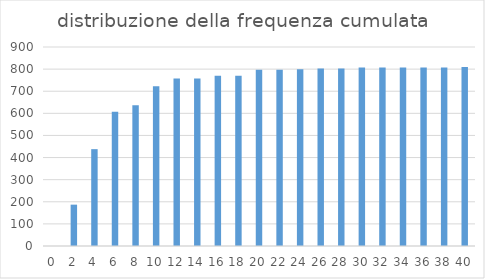
| Category | Series 0 |
|---|---|
| 0.0 | 0 |
| 2.0 | 187 |
| 4.0 | 438 |
| 6.0 | 607 |
| 8.0 | 637 |
| 10.0 | 722 |
| 12.0 | 757 |
| 14.0 | 757 |
| 16.0 | 770 |
| 18.0 | 770 |
| 20.0 | 797 |
| 22.0 | 797 |
| 24.0 | 799 |
| 26.0 | 803 |
| 28.0 | 803 |
| 30.0 | 807 |
| 32.0 | 807 |
| 34.0 | 807 |
| 36.0 | 807 |
| 38.0 | 807 |
| 40.0 | 810 |